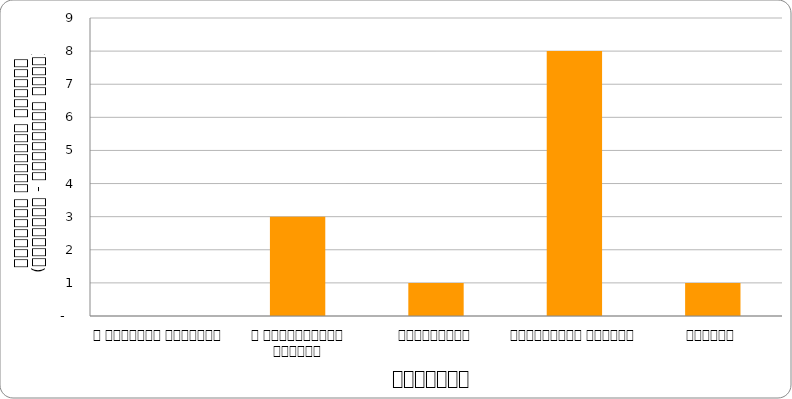
| Category | सुरक्षा |
|---|---|
| द हिमालयन टाइम्स् | 0 |
| द काठमाण्डौं पोस्ट् | 3 |
| कान्तिपुर | 1 |
| अन्नपूर्ण पोस्ट् | 8 |
| नागरिक | 1 |